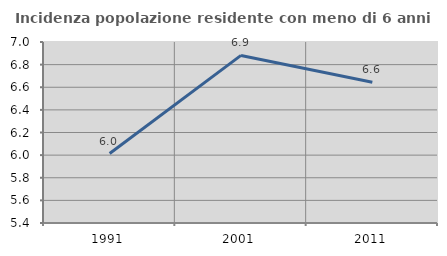
| Category | Incidenza popolazione residente con meno di 6 anni |
|---|---|
| 1991.0 | 6.014 |
| 2001.0 | 6.881 |
| 2011.0 | 6.645 |